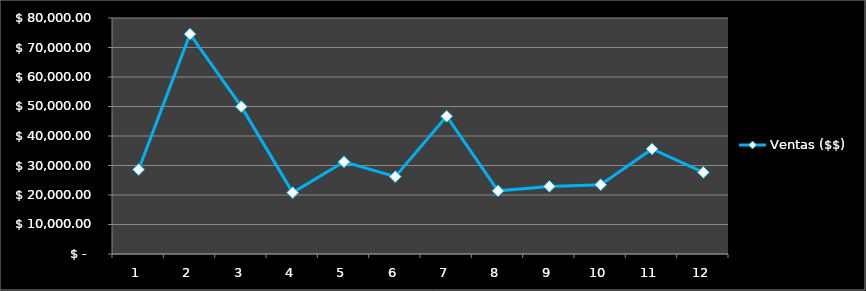
| Category | Ventas ($$) |
|---|---|
| 0 | 28633.36 |
| 1 | 74523.7 |
| 2 | 49952.01 |
| 3 | 20800.16 |
| 4 | 31262.34 |
| 5 | 26219.34 |
| 6 | 46701.925 |
| 7 | 21412.56 |
| 8 | 22916.82 |
| 9 | 23465.73 |
| 10 | 35624.87 |
| 11 | 27687.59 |